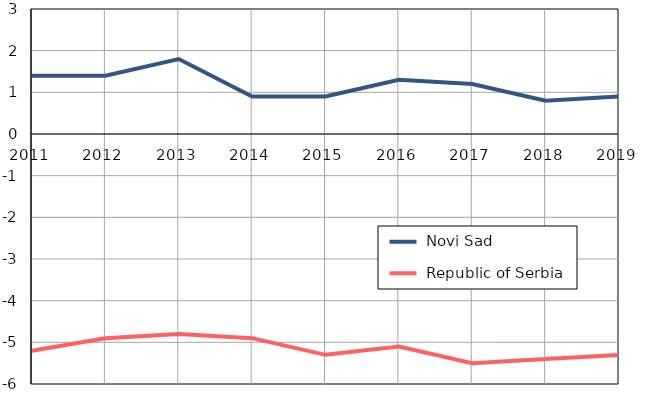
| Category |  Novi Sad |  Republic of Serbia |
|---|---|---|
| 2011.0 | 1.4 | -5.2 |
| 2012.0 | 1.4 | -4.9 |
| 2013.0 | 1.8 | -4.8 |
| 2014.0 | 0.9 | -4.9 |
| 2015.0 | 0.9 | -5.3 |
| 2016.0 | 1.3 | -5.1 |
| 2017.0 | 1.2 | -5.5 |
| 2018.0 | 0.8 | -5.4 |
| 2019.0 | 0.9 | -5.3 |